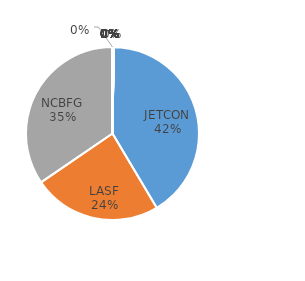
| Category | Total Spend |
|---|---|
| JETCON | 24000 |
| LASF | 13900 |
| NCBFG | 20000 |